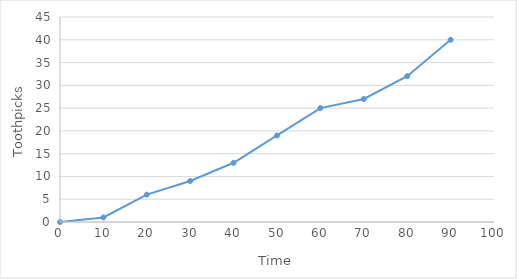
| Category | Number of Toothpicks Broken |
|---|---|
| 0.0 | 0 |
| 10.0 | 1 |
| 20.0 | 6 |
| 30.0 | 9 |
| 40.0 | 13 |
| 50.0 | 19 |
| 60.0 | 25 |
| 70.0 | 27 |
| 80.0 | 32 |
| 90.0 | 40 |